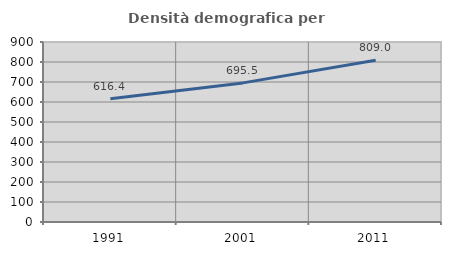
| Category | Densità demografica |
|---|---|
| 1991.0 | 616.379 |
| 2001.0 | 695.541 |
| 2011.0 | 808.987 |